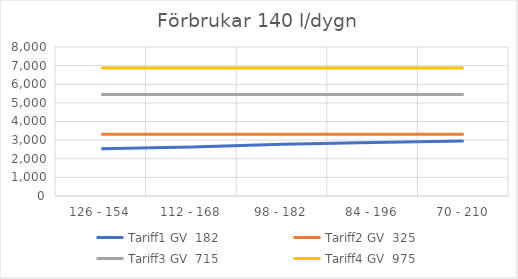
| Category | Tariff1 GV  | Tariff2 GV  | Tariff3 GV  | Tariff4 GV  |
|---|---|---|---|---|
| 126 - 154 | 2531.52 | 3312.375 | 5447.625 | 6871.125 |
| 112 - 168 | 2631.87 | 3312.375 | 5447.625 | 6871.125 |
| 98 - 182 | 2772.676 | 3312.375 | 5447.625 | 6871.125 |
| 84 - 196 | 2876.874 | 3313.111 | 5447.625 | 6871.125 |
| 70 - 210 | 2949.875 | 3318.737 | 5447.625 | 6871.125 |